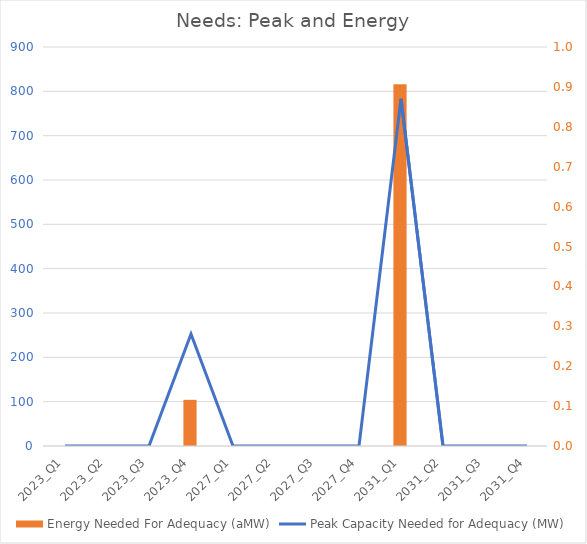
| Category | Energy Needed For Adequacy (aMW) |
|---|---|
| 2023_Q1 | 0 |
| 2023_Q2 | 0 |
| 2023_Q3 | 0 |
| 2023_Q4 | 0.116 |
| 2027_Q1 | 0 |
| 2027_Q2 | 0 |
| 2027_Q3 | 0 |
| 2027_Q4 | 0 |
| 2031_Q1 | 0.907 |
| 2031_Q2 | 0 |
| 2031_Q3 | 0 |
| 2031_Q4 | 0 |